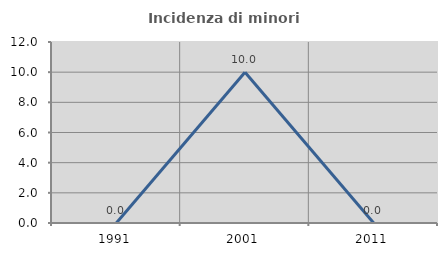
| Category | Incidenza di minori stranieri |
|---|---|
| 1991.0 | 0 |
| 2001.0 | 10 |
| 2011.0 | 0 |